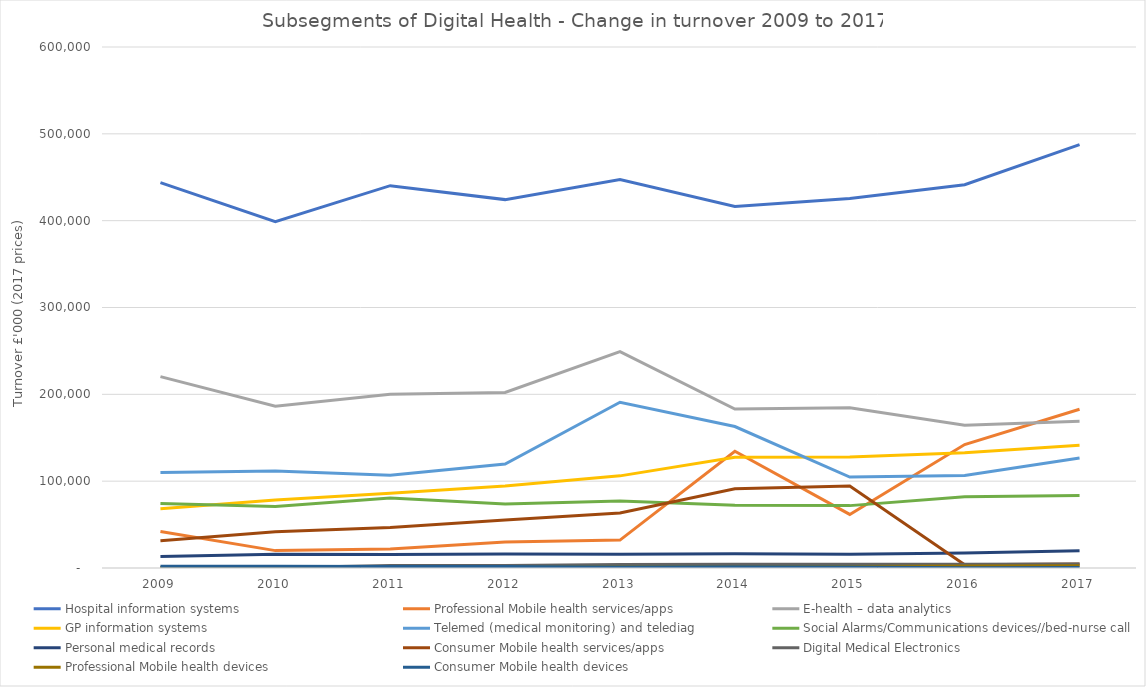
| Category |  Hospital information systems   |  Professional Mobile health services/apps  |  E-health – data analytics  |  GP information systems  |  Telemed (medical monitoring) and telediag   |  Social Alarms/Communications devices//bed-nurse call  |  Personal medical records  |  Consumer Mobile health services/apps  |  Digital Medical Electronics   |  Professional Mobile health devices  |  Consumer Mobile health devices  |
|---|---|---|---|---|---|---|---|---|---|---|---|
|  2009  | 443823 | 41964 | 220364 | 68169 | 109937 | 74408 | 13135 | 31366 | 332 | 597 | 2046 |
|  2010  | 398878 | 20012 | 186205 | 78396 | 111727 | 70723 | 15940 | 41612 | 376 | 793 | 2084 |
|  2011  | 440318 | 21767 | 200021 | 86225 | 106744 | 80571 | 15593 | 46765 | 2917 | 995 | 1827 |
|  2012  | 424247 | 29994 | 202216 | 94371 | 119674 | 73759 | 16107 | 55293 | 2947 | 1587 | 1618 |
|  2013  | 447330 | 32123 | 249282 | 106109 | 190831 | 77151 | 15973 | 63423 | 4146 | 1544 | 1266 |
|  2014  | 416283 | 134512 | 183068 | 127424 | 162914 | 72394 | 16323 | 91349 | 4261 | 1638 | 1312 |
|  2015  | 425654 | 61700 | 184409 | 127891 | 104709 | 71835 | 15828 | 94486 | 4370 | 1811 | 1247 |
|  2016  | 441317 | 142182 | 164428 | 132734 | 106585 | 81972 | 17222 | 3782 | 4195 | 2267 | 300 |
|  2017  | 487587 | 182861 | 168880 | 141455 | 126688 | 83481 | 19910 | 4515 | 4466 | 2701 | 605 |